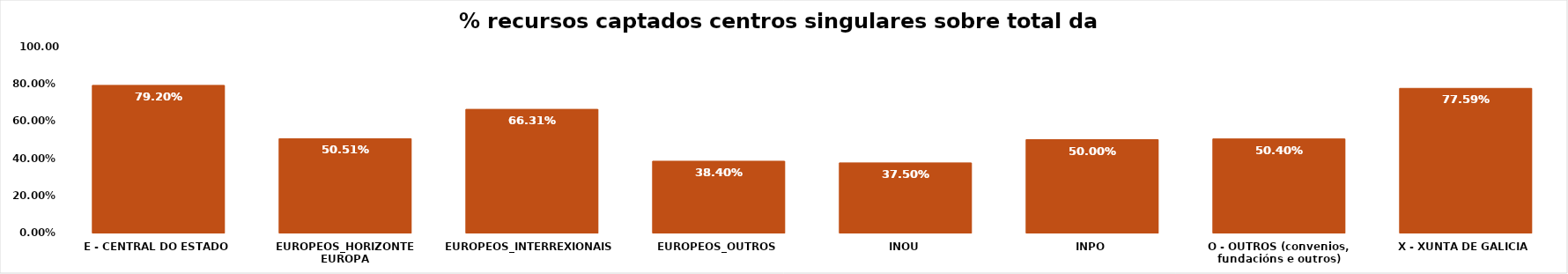
| Category | Series 0 |
|---|---|
| E - CENTRAL DO ESTADO | 0.792 |
| EUROPEOS_HORIZONTE EUROPA | 0.505 |
| EUROPEOS_INTERREXIONAIS | 0.663 |
| EUROPEOS_OUTROS | 0.384 |
| INOU | 0.375 |
| INPO | 0.5 |
| O - OUTROS (convenios, fundacións e outros) | 0.504 |
| X - XUNTA DE GALICIA | 0.776 |